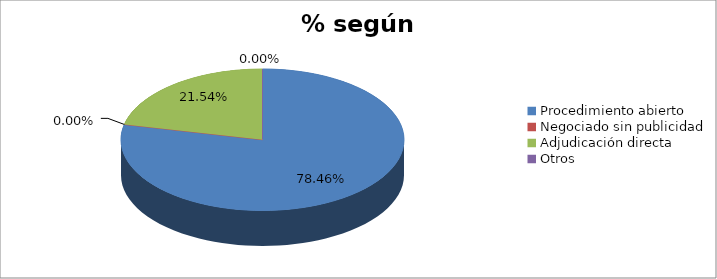
| Category | % según procedimiento |
|---|---|
| Procedimiento abierto | 0.785 |
| Negociado sin publicidad | 0 |
| Adjudicación directa | 0.215 |
| Otros | 0 |